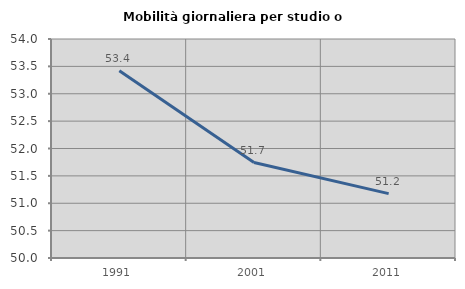
| Category | Mobilità giornaliera per studio o lavoro |
|---|---|
| 1991.0 | 53.422 |
| 2001.0 | 51.743 |
| 2011.0 | 51.175 |